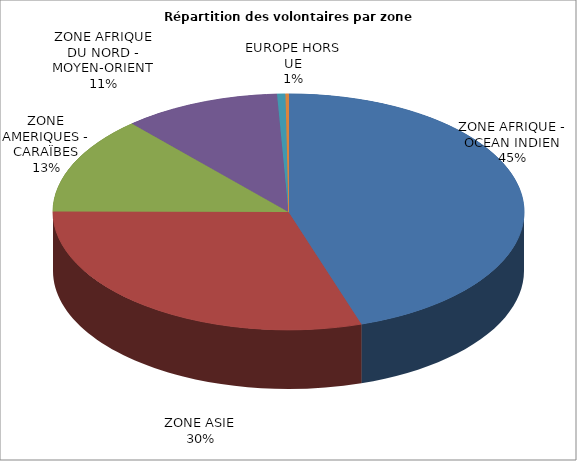
| Category | Series 0 | Series 1 |
|---|---|---|
| ZONE AFRIQUE - OCEAN INDIEN | 868 | 0.45 |
| ZONE ASIE | 580 | 0.301 |
| ZONE AMERIQUES - CARAÏBES | 258 | 0.134 |
| ZONE AFRIQUE DU NORD - MOYEN-ORIENT | 208 | 0.108 |
| EUROPE HORS UE | 11 | 0.006 |
| OCEANIE | 4 | 0.002 |